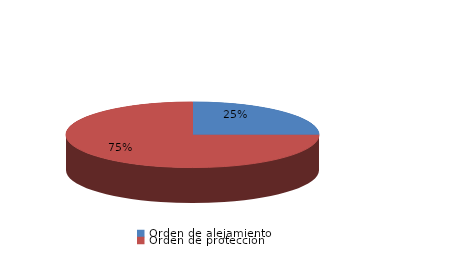
| Category | Series 0 |
|---|---|
| Orden de alejamiento | 1 |
| Orden de protección | 3 |